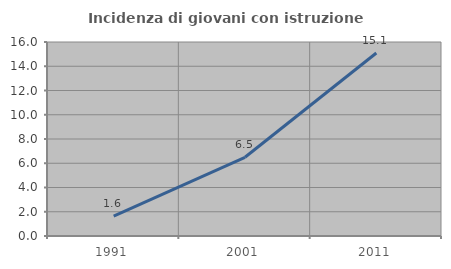
| Category | Incidenza di giovani con istruzione universitaria |
|---|---|
| 1991.0 | 1.639 |
| 2001.0 | 6.494 |
| 2011.0 | 15.094 |